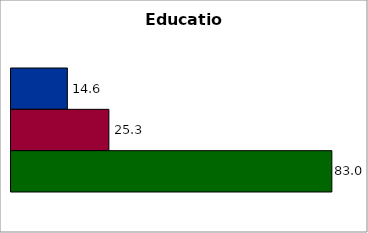
| Category | 50 states and D.C. | SREB states | State |
|---|---|---|---|
| 0 | 14.578 | 25.316 | 82.979 |